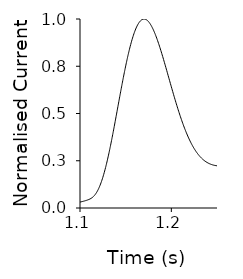
| Category | Y |
|---|---|
| 0.0 | 0 |
| 0.001 | 0 |
| 0.002 | 0 |
| 0.003 | 0 |
| 0.004 | 0 |
| 0.005 | 0 |
| 0.006 | 0 |
| 0.007 | 0.001 |
| 0.008 | 0.001 |
| 0.009 | 0.001 |
| 0.01 | 0.002 |
| 0.011 | 0.002 |
| 0.012 | 0.002 |
| 0.013 | 0.003 |
| 0.014 | 0.004 |
| 0.015 | 0.004 |
| 0.016 | 0.005 |
| 0.017 | 0.006 |
| 0.018 | 0.006 |
| 0.019 | 0.007 |
| 0.02 | 0.008 |
| 0.021 | 0.009 |
| 0.022 | 0.01 |
| 0.023 | 0.011 |
| 0.024 | 0.012 |
| 0.025 | 0.013 |
| 0.026 | 0.014 |
| 0.027 | 0.015 |
| 0.028 | 0.016 |
| 0.029 | 0.017 |
| 0.03 | 0.018 |
| 0.031 | 0.019 |
| 0.032 | 0.021 |
| 0.033 | 0.022 |
| 0.034 | 0.023 |
| 0.035 | 0.024 |
| 0.036 | 0.025 |
| 0.037 | 0.026 |
| 0.038 | 0.027 |
| 0.039 | 0.028 |
| 0.04 | 0.029 |
| 0.041 | 0.03 |
| 0.042 | 0.032 |
| 0.043 | 0.033 |
| 0.044 | 0.033 |
| 0.045 | 0.034 |
| 0.046 | 0.035 |
| 0.047 | 0.036 |
| 0.048 | 0.037 |
| 0.049 | 0.038 |
| 0.05 | 0.039 |
| 0.051 | 0.039 |
| 0.052 | 0.04 |
| 0.053 | 0.041 |
| 0.054 | 0.041 |
| 0.055 | 0.042 |
| 0.056 | 0.043 |
| 0.057 | 0.043 |
| 0.058 | 0.044 |
| 0.059 | 0.044 |
| 0.06 | 0.045 |
| 0.061 | 0.045 |
| 0.062 | 0.045 |
| 0.063 | 0.046 |
| 0.064 | 0.046 |
| 0.065 | 0.046 |
| 0.066 | 0.046 |
| 0.067 | 0.047 |
| 0.068 | 0.047 |
| 0.069 | 0.047 |
| 0.07 | 0.047 |
| 0.071 | 0.047 |
| 0.072 | 0.047 |
| 0.073 | 0.047 |
| 0.074 | 0.047 |
| 0.075 | 0.047 |
| 0.076 | 0.047 |
| 0.077 | 0.047 |
| 0.078 | 0.047 |
| 0.079 | 0.047 |
| 0.08 | 0.047 |
| 0.081 | 0.047 |
| 0.082 | 0.047 |
| 0.083 | 0.047 |
| 0.084 | 0.047 |
| 0.085 | 0.047 |
| 0.086 | 0.047 |
| 0.087 | 0.047 |
| 0.088 | 0.046 |
| 0.089 | 0.046 |
| 0.09 | 0.046 |
| 0.091 | 0.046 |
| 0.092 | 0.046 |
| 0.093 | 0.046 |
| 0.094 | 0.046 |
| 0.095 | 0.046 |
| 0.096 | 0.045 |
| 0.097 | 0.045 |
| 0.098 | 0.045 |
| 0.099 | 0.045 |
| 0.1 | 0.045 |
| 0.101 | 0.045 |
| 0.102 | 0.045 |
| 0.103 | 0.045 |
| 0.104 | 0.045 |
| 0.105 | 0.045 |
| 0.106 | 0.044 |
| 0.107 | 0.044 |
| 0.108 | 0.044 |
| 0.109 | 0.044 |
| 0.11 | 0.044 |
| 0.111 | 0.044 |
| 0.112 | 0.044 |
| 0.113 | 0.044 |
| 0.114 | 0.044 |
| 0.115 | 0.044 |
| 0.116 | 0.044 |
| 0.117 | 0.044 |
| 0.118 | 0.044 |
| 0.119 | 0.044 |
| 0.12 | 0.044 |
| 0.121 | 0.044 |
| 0.122 | 0.044 |
| 0.123 | 0.044 |
| 0.124 | 0.044 |
| 0.125 | 0.043 |
| 0.126 | 0.043 |
| 0.127 | 0.043 |
| 0.128 | 0.043 |
| 0.129 | 0.043 |
| 0.13 | 0.043 |
| 0.131 | 0.043 |
| 0.132 | 0.043 |
| 0.133 | 0.043 |
| 0.134 | 0.043 |
| 0.135 | 0.044 |
| 0.136 | 0.044 |
| 0.137 | 0.044 |
| 0.138 | 0.044 |
| 0.139 | 0.044 |
| 0.14 | 0.044 |
| 0.141 | 0.044 |
| 0.142 | 0.044 |
| 0.143 | 0.044 |
| 0.144 | 0.044 |
| 0.145 | 0.044 |
| 0.146 | 0.044 |
| 0.147 | 0.044 |
| 0.148 | 0.044 |
| 0.149 | 0.044 |
| 0.15 | 0.044 |
| 0.151 | 0.044 |
| 0.152 | 0.044 |
| 0.153 | 0.044 |
| 0.154 | 0.044 |
| 0.155 | 0.044 |
| 0.156 | 0.044 |
| 0.157 | 0.044 |
| 0.158 | 0.044 |
| 0.159 | 0.044 |
| 0.16 | 0.044 |
| 0.161 | 0.044 |
| 0.162 | 0.045 |
| 0.163 | 0.045 |
| 0.164 | 0.045 |
| 0.165 | 0.045 |
| 0.166 | 0.045 |
| 0.167 | 0.045 |
| 0.168 | 0.045 |
| 0.169 | 0.045 |
| 0.17 | 0.045 |
| 0.171 | 0.045 |
| 0.172 | 0.045 |
| 0.173 | 0.045 |
| 0.174 | 0.045 |
| 0.175 | 0.045 |
| 0.176 | 0.045 |
| 0.177 | 0.045 |
| 0.178 | 0.045 |
| 0.179 | 0.045 |
| 0.18 | 0.045 |
| 0.181 | 0.045 |
| 0.182 | 0.045 |
| 0.183 | 0.045 |
| 0.184 | 0.045 |
| 0.185 | 0.045 |
| 0.186 | 0.045 |
| 0.187 | 0.045 |
| 0.188 | 0.045 |
| 0.189 | 0.045 |
| 0.19 | 0.045 |
| 0.191 | 0.045 |
| 0.192 | 0.045 |
| 0.193 | 0.045 |
| 0.194 | 0.045 |
| 0.195 | 0.045 |
| 0.196 | 0.045 |
| 0.197 | 0.045 |
| 0.198 | 0.045 |
| 0.199 | 0.046 |
| 0.2 | 0.046 |
| 0.201 | 0.046 |
| 0.202 | 0.046 |
| 0.203 | 0.046 |
| 0.204 | 0.046 |
| 0.205 | 0.046 |
| 0.206 | 0.046 |
| 0.207 | 0.046 |
| 0.208 | 0.046 |
| 0.209 | 0.046 |
| 0.21 | 0.046 |
| 0.211 | 0.046 |
| 0.212 | 0.046 |
| 0.213 | 0.046 |
| 0.214 | 0.046 |
| 0.215 | 0.046 |
| 0.216 | 0.046 |
| 0.217 | 0.046 |
| 0.218 | 0.046 |
| 0.219 | 0.046 |
| 0.22 | 0.046 |
| 0.221 | 0.046 |
| 0.222 | 0.046 |
| 0.223 | 0.046 |
| 0.224 | 0.046 |
| 0.225 | 0.046 |
| 0.226 | 0.046 |
| 0.227 | 0.046 |
| 0.228 | 0.045 |
| 0.229 | 0.045 |
| 0.23 | 0.045 |
| 0.231 | 0.045 |
| 0.232 | 0.045 |
| 0.233 | 0.045 |
| 0.234 | 0.045 |
| 0.235 | 0.045 |
| 0.236 | 0.045 |
| 0.237 | 0.045 |
| 0.238 | 0.045 |
| 0.239 | 0.044 |
| 0.24 | 0.044 |
| 0.241 | 0.044 |
| 0.242 | 0.044 |
| 0.243 | 0.044 |
| 0.244 | 0.044 |
| 0.245 | 0.044 |
| 0.246 | 0.044 |
| 0.247 | 0.044 |
| 0.248 | 0.044 |
| 0.249 | 0.044 |
| 0.25 | 0.043 |
| 0.251 | 0.043 |
| 0.252 | 0.043 |
| 0.253 | 0.043 |
| 0.254 | 0.043 |
| 0.255 | 0.043 |
| 0.256 | 0.043 |
| 0.257 | 0.043 |
| 0.258 | 0.043 |
| 0.259 | 0.043 |
| 0.26 | 0.043 |
| 0.261 | 0.043 |
| 0.262 | 0.043 |
| 0.263 | 0.043 |
| 0.264 | 0.043 |
| 0.265 | 0.043 |
| 0.266 | 0.043 |
| 0.267 | 0.043 |
| 0.268 | 0.043 |
| 0.269 | 0.043 |
| 0.27 | 0.043 |
| 0.271 | 0.043 |
| 0.272 | 0.043 |
| 0.273 | 0.043 |
| 0.274 | 0.043 |
| 0.275 | 0.043 |
| 0.276 | 0.043 |
| 0.277 | 0.043 |
| 0.278 | 0.043 |
| 0.279 | 0.043 |
| 0.28 | 0.043 |
| 0.281 | 0.043 |
| 0.282 | 0.044 |
| 0.283 | 0.044 |
| 0.284 | 0.044 |
| 0.285 | 0.044 |
| 0.286 | 0.044 |
| 0.287 | 0.044 |
| 0.288 | 0.044 |
| 0.289 | 0.044 |
| 0.29 | 0.044 |
| 0.291 | 0.044 |
| 0.292 | 0.044 |
| 0.293 | 0.044 |
| 0.294 | 0.044 |
| 0.295 | 0.044 |
| 0.296 | 0.044 |
| 0.297 | 0.044 |
| 0.298 | 0.044 |
| 0.299 | 0.044 |
| 0.3 | 0.044 |
| 0.301 | 0.044 |
| 0.302 | 0.044 |
| 0.303 | 0.044 |
| 0.304 | 0.044 |
| 0.305 | 0.044 |
| 0.306 | 0.044 |
| 0.307 | 0.044 |
| 0.308 | 0.044 |
| 0.309 | 0.044 |
| 0.31 | 0.044 |
| 0.311 | 0.044 |
| 0.312 | 0.044 |
| 0.313 | 0.044 |
| 0.314 | 0.044 |
| 0.315 | 0.044 |
| 0.316 | 0.044 |
| 0.317 | 0.044 |
| 0.318 | 0.044 |
| 0.319 | 0.044 |
| 0.32 | 0.044 |
| 0.321 | 0.044 |
| 0.322 | 0.044 |
| 0.323 | 0.044 |
| 0.324 | 0.044 |
| 0.325 | 0.044 |
| 0.326 | 0.044 |
| 0.327 | 0.044 |
| 0.328 | 0.044 |
| 0.329 | 0.043 |
| 0.33 | 0.043 |
| 0.331 | 0.043 |
| 0.332 | 0.043 |
| 0.333 | 0.043 |
| 0.334 | 0.043 |
| 0.335 | 0.043 |
| 0.336 | 0.043 |
| 0.337 | 0.043 |
| 0.338 | 0.043 |
| 0.339 | 0.044 |
| 0.34 | 0.044 |
| 0.341 | 0.045 |
| 0.342 | 0.046 |
| 0.343 | 0.047 |
| 0.344 | 0.048 |
| 0.345 | 0.049 |
| 0.346 | 0.051 |
| 0.347 | 0.053 |
| 0.348 | 0.056 |
| 0.349 | 0.058 |
| 0.35 | 0.061 |
| 0.351 | 0.064 |
| 0.352 | 0.068 |
| 0.353 | 0.072 |
| 0.354 | 0.076 |
| 0.355 | 0.081 |
| 0.356 | 0.085 |
| 0.357 | 0.09 |
| 0.358 | 0.096 |
| 0.359 | 0.101 |
| 0.36 | 0.107 |
| 0.361 | 0.113 |
| 0.362 | 0.118 |
| 0.363 | 0.124 |
| 0.364 | 0.13 |
| 0.365 | 0.136 |
| 0.366 | 0.142 |
| 0.367 | 0.147 |
| 0.368 | 0.152 |
| 0.369 | 0.157 |
| 0.37 | 0.161 |
| 0.371 | 0.165 |
| 0.372 | 0.168 |
| 0.373 | 0.171 |
| 0.374 | 0.173 |
| 0.375 | 0.174 |
| 0.376 | 0.175 |
| 0.377 | 0.175 |
| 0.378 | 0.174 |
| 0.379 | 0.172 |
| 0.38 | 0.169 |
| 0.381 | 0.166 |
| 0.382 | 0.162 |
| 0.383 | 0.157 |
| 0.384 | 0.151 |
| 0.385 | 0.145 |
| 0.386 | 0.138 |
| 0.387 | 0.131 |
| 0.388 | 0.122 |
| 0.389 | 0.114 |
| 0.39 | 0.104 |
| 0.391 | 0.094 |
| 0.392 | 0.084 |
| 0.393 | 0.073 |
| 0.394 | 0.062 |
| 0.395 | 0.051 |
| 0.396 | 0.039 |
| 0.397 | 0.027 |
| 0.398 | 0.015 |
| 0.399 | 0.003 |
| 0.4 | -0.009 |
| 0.401 | -0.022 |
| 0.402 | -0.034 |
| 0.403 | -0.047 |
| 0.404 | -0.06 |
| 0.405 | -0.072 |
| 0.406 | -0.084 |
| 0.407 | -0.096 |
| 0.408 | -0.108 |
| 0.409 | -0.12 |
| 0.41 | -0.131 |
| 0.411 | -0.142 |
| 0.412 | -0.153 |
| 0.413 | -0.163 |
| 0.414 | -0.173 |
| 0.415 | -0.183 |
| 0.416 | -0.192 |
| 0.417 | -0.2 |
| 0.418 | -0.209 |
| 0.419 | -0.216 |
| 0.42 | -0.223 |
| 0.421 | -0.23 |
| 0.422 | -0.236 |
| 0.423 | -0.242 |
| 0.424 | -0.246 |
| 0.425 | -0.251 |
| 0.426 | -0.254 |
| 0.427 | -0.257 |
| 0.428 | -0.26 |
| 0.429 | -0.261 |
| 0.43 | -0.262 |
| 0.431 | -0.263 |
| 0.432 | -0.263 |
| 0.433 | -0.262 |
| 0.434 | -0.261 |
| 0.435 | -0.259 |
| 0.436 | -0.256 |
| 0.437 | -0.253 |
| 0.438 | -0.25 |
| 0.439 | -0.246 |
| 0.44 | -0.242 |
| 0.441 | -0.237 |
| 0.442 | -0.231 |
| 0.443 | -0.226 |
| 0.444 | -0.22 |
| 0.445 | -0.213 |
| 0.446 | -0.207 |
| 0.447 | -0.2 |
| 0.448 | -0.192 |
| 0.449 | -0.184 |
| 0.45 | -0.177 |
| 0.451 | -0.168 |
| 0.452 | -0.16 |
| 0.453 | -0.151 |
| 0.454 | -0.143 |
| 0.455 | -0.134 |
| 0.456 | -0.125 |
| 0.457 | -0.116 |
| 0.458 | -0.106 |
| 0.459 | -0.097 |
| 0.46 | -0.088 |
| 0.461 | -0.078 |
| 0.462 | -0.069 |
| 0.463 | -0.06 |
| 0.464 | -0.051 |
| 0.465 | -0.042 |
| 0.466 | -0.033 |
| 0.467 | -0.025 |
| 0.468 | -0.017 |
| 0.469 | -0.009 |
| 0.47 | -0.002 |
| 0.471 | 0.005 |
| 0.472 | 0.011 |
| 0.473 | 0.017 |
| 0.474 | 0.022 |
| 0.475 | 0.027 |
| 0.476 | 0.031 |
| 0.477 | 0.035 |
| 0.478 | 0.038 |
| 0.479 | 0.041 |
| 0.48 | 0.043 |
| 0.481 | 0.044 |
| 0.482 | 0.045 |
| 0.483 | 0.046 |
| 0.484 | 0.046 |
| 0.485 | 0.046 |
| 0.486 | 0.045 |
| 0.487 | 0.043 |
| 0.488 | 0.041 |
| 0.489 | 0.039 |
| 0.49 | 0.036 |
| 0.491 | 0.033 |
| 0.492 | 0.029 |
| 0.493 | 0.025 |
| 0.494 | 0.021 |
| 0.495 | 0.017 |
| 0.496 | 0.012 |
| 0.497 | 0.007 |
| 0.498 | 0.002 |
| 0.499 | -0.003 |
| 0.5 | -0.009 |
| 0.501 | -0.014 |
| 0.502 | -0.02 |
| 0.503 | -0.025 |
| 0.504 | -0.031 |
| 0.505 | -0.037 |
| 0.506 | -0.042 |
| 0.507 | -0.048 |
| 0.508 | -0.054 |
| 0.509 | -0.059 |
| 0.51 | -0.065 |
| 0.511 | -0.07 |
| 0.512 | -0.076 |
| 0.513 | -0.081 |
| 0.514 | -0.086 |
| 0.515 | -0.091 |
| 0.516 | -0.096 |
| 0.517 | -0.101 |
| 0.518 | -0.105 |
| 0.519 | -0.11 |
| 0.52 | -0.114 |
| 0.521 | -0.117 |
| 0.522 | -0.121 |
| 0.523 | -0.125 |
| 0.524 | -0.128 |
| 0.525 | -0.131 |
| 0.526 | -0.133 |
| 0.527 | -0.136 |
| 0.528 | -0.138 |
| 0.529 | -0.14 |
| 0.53 | -0.142 |
| 0.531 | -0.143 |
| 0.532 | -0.145 |
| 0.533 | -0.146 |
| 0.534 | -0.147 |
| 0.535 | -0.148 |
| 0.536 | -0.149 |
| 0.537 | -0.15 |
| 0.538 | -0.151 |
| 0.539 | -0.151 |
| 0.54 | -0.152 |
| 0.541 | -0.152 |
| 0.542 | -0.152 |
| 0.543 | -0.152 |
| 0.544 | -0.153 |
| 0.545 | -0.153 |
| 0.546 | -0.153 |
| 0.547 | -0.153 |
| 0.548 | -0.153 |
| 0.549 | -0.153 |
| 0.55 | -0.152 |
| 0.551 | -0.152 |
| 0.552 | -0.152 |
| 0.553 | -0.152 |
| 0.554 | -0.152 |
| 0.555 | -0.152 |
| 0.556 | -0.152 |
| 0.557 | -0.151 |
| 0.558 | -0.151 |
| 0.559 | -0.151 |
| 0.56 | -0.151 |
| 0.561 | -0.151 |
| 0.562 | -0.15 |
| 0.563 | -0.15 |
| 0.564 | -0.149 |
| 0.565 | -0.149 |
| 0.566 | -0.148 |
| 0.567 | -0.147 |
| 0.568 | -0.146 |
| 0.569 | -0.145 |
| 0.57 | -0.144 |
| 0.571 | -0.143 |
| 0.572 | -0.141 |
| 0.573 | -0.14 |
| 0.574 | -0.138 |
| 0.575 | -0.136 |
| 0.576 | -0.134 |
| 0.577 | -0.132 |
| 0.578 | -0.129 |
| 0.579 | -0.127 |
| 0.58 | -0.124 |
| 0.581 | -0.122 |
| 0.582 | -0.119 |
| 0.583 | -0.116 |
| 0.584 | -0.113 |
| 0.585 | -0.11 |
| 0.586 | -0.107 |
| 0.587 | -0.104 |
| 0.588 | -0.101 |
| 0.589 | -0.098 |
| 0.59 | -0.094 |
| 0.591 | -0.091 |
| 0.592 | -0.088 |
| 0.593 | -0.085 |
| 0.594 | -0.082 |
| 0.595 | -0.079 |
| 0.596 | -0.076 |
| 0.597 | -0.073 |
| 0.598 | -0.07 |
| 0.599 | -0.067 |
| 0.6 | -0.065 |
| 0.601 | -0.062 |
| 0.602 | -0.06 |
| 0.603 | -0.058 |
| 0.604 | -0.056 |
| 0.605 | -0.054 |
| 0.606 | -0.052 |
| 0.607 | -0.05 |
| 0.608 | -0.049 |
| 0.609 | -0.048 |
| 0.61 | -0.047 |
| 0.611 | -0.045 |
| 0.612 | -0.045 |
| 0.613 | -0.044 |
| 0.614 | -0.043 |
| 0.615 | -0.043 |
| 0.616 | -0.042 |
| 0.617 | -0.042 |
| 0.618 | -0.042 |
| 0.619 | -0.041 |
| 0.62 | -0.041 |
| 0.621 | -0.041 |
| 0.622 | -0.042 |
| 0.623 | -0.042 |
| 0.624 | -0.042 |
| 0.625 | -0.042 |
| 0.626 | -0.042 |
| 0.627 | -0.043 |
| 0.628 | -0.043 |
| 0.629 | -0.043 |
| 0.63 | -0.044 |
| 0.631 | -0.044 |
| 0.632 | -0.044 |
| 0.633 | -0.045 |
| 0.634 | -0.045 |
| 0.635 | -0.045 |
| 0.636 | -0.046 |
| 0.637 | -0.046 |
| 0.638 | -0.047 |
| 0.639 | -0.047 |
| 0.64 | -0.048 |
| 0.641 | -0.048 |
| 0.642 | -0.049 |
| 0.643 | -0.049 |
| 0.644 | -0.05 |
| 0.645 | -0.05 |
| 0.646 | -0.051 |
| 0.647 | -0.052 |
| 0.648 | -0.052 |
| 0.649 | -0.053 |
| 0.65 | -0.053 |
| 0.651 | -0.054 |
| 0.652 | -0.054 |
| 0.653 | -0.054 |
| 0.654 | -0.054 |
| 0.655 | -0.054 |
| 0.656 | -0.054 |
| 0.657 | -0.054 |
| 0.658 | -0.054 |
| 0.659 | -0.053 |
| 0.66 | -0.053 |
| 0.661 | -0.052 |
| 0.662 | -0.052 |
| 0.663 | -0.051 |
| 0.664 | -0.05 |
| 0.665 | -0.049 |
| 0.666 | -0.048 |
| 0.667 | -0.047 |
| 0.668 | -0.046 |
| 0.669 | -0.045 |
| 0.67 | -0.044 |
| 0.671 | -0.043 |
| 0.672 | -0.041 |
| 0.673 | -0.04 |
| 0.674 | -0.039 |
| 0.675 | -0.038 |
| 0.676 | -0.037 |
| 0.677 | -0.036 |
| 0.678 | -0.035 |
| 0.679 | -0.033 |
| 0.68 | -0.032 |
| 0.681 | -0.031 |
| 0.682 | -0.03 |
| 0.683 | -0.029 |
| 0.684 | -0.029 |
| 0.685 | -0.028 |
| 0.686 | -0.027 |
| 0.687 | -0.026 |
| 0.688 | -0.026 |
| 0.689 | -0.025 |
| 0.69 | -0.024 |
| 0.691 | -0.024 |
| 0.692 | -0.023 |
| 0.693 | -0.023 |
| 0.694 | -0.023 |
| 0.695 | -0.022 |
| 0.696 | -0.022 |
| 0.697 | -0.022 |
| 0.698 | -0.021 |
| 0.699 | -0.021 |
| 0.7 | -0.021 |
| 0.701 | -0.021 |
| 0.702 | -0.021 |
| 0.703 | -0.021 |
| 0.704 | -0.021 |
| 0.705 | -0.021 |
| 0.706 | -0.021 |
| 0.707 | -0.021 |
| 0.708 | -0.021 |
| 0.709 | -0.021 |
| 0.71 | -0.021 |
| 0.711 | -0.021 |
| 0.712 | -0.021 |
| 0.713 | -0.021 |
| 0.714 | -0.021 |
| 0.715 | -0.021 |
| 0.716 | -0.021 |
| 0.717 | -0.021 |
| 0.718 | -0.021 |
| 0.719 | -0.021 |
| 0.72 | -0.022 |
| 0.721 | -0.022 |
| 0.722 | -0.022 |
| 0.723 | -0.023 |
| 0.724 | -0.023 |
| 0.725 | -0.024 |
| 0.726 | -0.025 |
| 0.727 | -0.025 |
| 0.728 | -0.026 |
| 0.729 | -0.027 |
| 0.73 | -0.028 |
| 0.731 | -0.029 |
| 0.732 | -0.03 |
| 0.733 | -0.032 |
| 0.734 | -0.033 |
| 0.735 | -0.035 |
| 0.736 | -0.036 |
| 0.737 | -0.038 |
| 0.738 | -0.04 |
| 0.739 | -0.041 |
| 0.74 | -0.043 |
| 0.741 | -0.045 |
| 0.742 | -0.047 |
| 0.743 | -0.049 |
| 0.744 | -0.051 |
| 0.745 | -0.053 |
| 0.746 | -0.055 |
| 0.747 | -0.057 |
| 0.748 | -0.059 |
| 0.749 | -0.061 |
| 0.75 | -0.062 |
| 0.751 | -0.064 |
| 0.752 | -0.065 |
| 0.753 | -0.067 |
| 0.754 | -0.068 |
| 0.755 | -0.07 |
| 0.756 | -0.071 |
| 0.757 | -0.072 |
| 0.758 | -0.072 |
| 0.759 | -0.073 |
| 0.76 | -0.074 |
| 0.761 | -0.074 |
| 0.762 | -0.074 |
| 0.763 | -0.075 |
| 0.764 | -0.075 |
| 0.765 | -0.074 |
| 0.766 | -0.074 |
| 0.767 | -0.074 |
| 0.768 | -0.073 |
| 0.769 | -0.073 |
| 0.77 | -0.072 |
| 0.771 | -0.072 |
| 0.772 | -0.071 |
| 0.773 | -0.07 |
| 0.774 | -0.069 |
| 0.775 | -0.068 |
| 0.776 | -0.067 |
| 0.777 | -0.066 |
| 0.778 | -0.064 |
| 0.779 | -0.063 |
| 0.78 | -0.062 |
| 0.781 | -0.061 |
| 0.782 | -0.059 |
| 0.783 | -0.058 |
| 0.784 | -0.057 |
| 0.785 | -0.055 |
| 0.786 | -0.054 |
| 0.787 | -0.052 |
| 0.788 | -0.051 |
| 0.789 | -0.05 |
| 0.79 | -0.048 |
| 0.791 | -0.047 |
| 0.792 | -0.045 |
| 0.793 | -0.044 |
| 0.794 | -0.043 |
| 0.795 | -0.041 |
| 0.796 | -0.04 |
| 0.797 | -0.039 |
| 0.798 | -0.038 |
| 0.799 | -0.037 |
| 0.8 | -0.035 |
| 0.801 | -0.034 |
| 0.802 | -0.033 |
| 0.803 | -0.032 |
| 0.804 | -0.031 |
| 0.805 | -0.03 |
| 0.806 | -0.029 |
| 0.807 | -0.028 |
| 0.808 | -0.026 |
| 0.809 | -0.025 |
| 0.81 | -0.024 |
| 0.811 | -0.023 |
| 0.812 | -0.022 |
| 0.813 | -0.021 |
| 0.814 | -0.019 |
| 0.815 | -0.018 |
| 0.816 | -0.017 |
| 0.817 | -0.016 |
| 0.818 | -0.015 |
| 0.819 | -0.014 |
| 0.82 | -0.013 |
| 0.821 | -0.012 |
| 0.822 | -0.012 |
| 0.823 | -0.011 |
| 0.824 | -0.01 |
| 0.825 | -0.01 |
| 0.826 | -0.009 |
| 0.827 | -0.009 |
| 0.828 | -0.009 |
| 0.829 | -0.009 |
| 0.83 | -0.009 |
| 0.831 | -0.009 |
| 0.832 | -0.009 |
| 0.833 | -0.009 |
| 0.834 | -0.009 |
| 0.835 | -0.01 |
| 0.836 | -0.01 |
| 0.837 | -0.011 |
| 0.838 | -0.011 |
| 0.839 | -0.012 |
| 0.84 | -0.012 |
| 0.841 | -0.013 |
| 0.842 | -0.014 |
| 0.843 | -0.015 |
| 0.844 | -0.016 |
| 0.845 | -0.017 |
| 0.846 | -0.017 |
| 0.847 | -0.018 |
| 0.848 | -0.019 |
| 0.849 | -0.02 |
| 0.85 | -0.021 |
| 0.851 | -0.022 |
| 0.852 | -0.023 |
| 0.853 | -0.024 |
| 0.854 | -0.025 |
| 0.855 | -0.026 |
| 0.856 | -0.027 |
| 0.857 | -0.028 |
| 0.858 | -0.029 |
| 0.859 | -0.03 |
| 0.86 | -0.031 |
| 0.861 | -0.032 |
| 0.862 | -0.033 |
| 0.863 | -0.033 |
| 0.864 | -0.034 |
| 0.865 | -0.035 |
| 0.866 | -0.035 |
| 0.867 | -0.036 |
| 0.868 | -0.036 |
| 0.869 | -0.037 |
| 0.87 | -0.037 |
| 0.871 | -0.037 |
| 0.872 | -0.037 |
| 0.873 | -0.038 |
| 0.874 | -0.038 |
| 0.875 | -0.038 |
| 0.876 | -0.038 |
| 0.877 | -0.038 |
| 0.878 | -0.038 |
| 0.879 | -0.038 |
| 0.88 | -0.038 |
| 0.881 | -0.037 |
| 0.882 | -0.037 |
| 0.883 | -0.037 |
| 0.884 | -0.037 |
| 0.885 | -0.037 |
| 0.886 | -0.037 |
| 0.887 | -0.036 |
| 0.888 | -0.036 |
| 0.889 | -0.036 |
| 0.89 | -0.036 |
| 0.891 | -0.036 |
| 0.892 | -0.035 |
| 0.893 | -0.035 |
| 0.894 | -0.035 |
| 0.895 | -0.035 |
| 0.896 | -0.035 |
| 0.897 | -0.034 |
| 0.898 | -0.034 |
| 0.899 | -0.034 |
| 0.9 | -0.034 |
| 0.901 | -0.033 |
| 0.902 | -0.033 |
| 0.903 | -0.033 |
| 0.904 | -0.033 |
| 0.905 | -0.032 |
| 0.906 | -0.032 |
| 0.907 | -0.032 |
| 0.908 | -0.032 |
| 0.909 | -0.031 |
| 0.91 | -0.031 |
| 0.911 | -0.031 |
| 0.912 | -0.031 |
| 0.913 | -0.03 |
| 0.914 | -0.03 |
| 0.915 | -0.03 |
| 0.916 | -0.03 |
| 0.917 | -0.03 |
| 0.918 | -0.029 |
| 0.919 | -0.029 |
| 0.92 | -0.029 |
| 0.921 | -0.029 |
| 0.922 | -0.029 |
| 0.923 | -0.03 |
| 0.924 | -0.03 |
| 0.925 | -0.03 |
| 0.926 | -0.03 |
| 0.927 | -0.031 |
| 0.928 | -0.031 |
| 0.929 | -0.031 |
| 0.93 | -0.032 |
| 0.931 | -0.033 |
| 0.932 | -0.033 |
| 0.933 | -0.034 |
| 0.934 | -0.034 |
| 0.935 | -0.035 |
| 0.936 | -0.036 |
| 0.937 | -0.037 |
| 0.938 | -0.037 |
| 0.939 | -0.038 |
| 0.94 | -0.039 |
| 0.941 | -0.04 |
| 0.942 | -0.041 |
| 0.943 | -0.042 |
| 0.944 | -0.043 |
| 0.945 | -0.043 |
| 0.946 | -0.044 |
| 0.947 | -0.045 |
| 0.948 | -0.046 |
| 0.949 | -0.047 |
| 0.95 | -0.048 |
| 0.951 | -0.049 |
| 0.952 | -0.05 |
| 0.953 | -0.051 |
| 0.954 | -0.052 |
| 0.955 | -0.053 |
| 0.956 | -0.054 |
| 0.957 | -0.055 |
| 0.958 | -0.056 |
| 0.959 | -0.057 |
| 0.96 | -0.058 |
| 0.961 | -0.059 |
| 0.962 | -0.06 |
| 0.963 | -0.061 |
| 0.964 | -0.062 |
| 0.965 | -0.063 |
| 0.966 | -0.063 |
| 0.967 | -0.064 |
| 0.968 | -0.065 |
| 0.969 | -0.066 |
| 0.97 | -0.067 |
| 0.971 | -0.067 |
| 0.972 | -0.068 |
| 0.973 | -0.069 |
| 0.974 | -0.069 |
| 0.975 | -0.07 |
| 0.976 | -0.07 |
| 0.977 | -0.071 |
| 0.978 | -0.071 |
| 0.979 | -0.072 |
| 0.98 | -0.072 |
| 0.981 | -0.072 |
| 0.982 | -0.073 |
| 0.983 | -0.073 |
| 0.984 | -0.073 |
| 0.985 | -0.073 |
| 0.986 | -0.073 |
| 0.987 | -0.073 |
| 0.988 | -0.073 |
| 0.989 | -0.072 |
| 0.99 | -0.072 |
| 0.991 | -0.072 |
| 0.992 | -0.072 |
| 0.993 | -0.071 |
| 0.994 | -0.071 |
| 0.995 | -0.07 |
| 0.996 | -0.069 |
| 0.997 | -0.069 |
| 0.998 | -0.068 |
| 0.999 | -0.067 |
| 1.0 | -0.066 |
| 1.001 | -0.065 |
| 1.002 | -0.064 |
| 1.003 | -0.063 |
| 1.004 | -0.061 |
| 1.005 | -0.06 |
| 1.006 | -0.058 |
| 1.007 | -0.057 |
| 1.008 | -0.055 |
| 1.009 | -0.054 |
| 1.01 | -0.052 |
| 1.011 | -0.05 |
| 1.012 | -0.048 |
| 1.013 | -0.046 |
| 1.014 | -0.044 |
| 1.015 | -0.043 |
| 1.016 | -0.041 |
| 1.017 | -0.039 |
| 1.018 | -0.037 |
| 1.019 | -0.035 |
| 1.02 | -0.033 |
| 1.021 | -0.031 |
| 1.022 | -0.029 |
| 1.023 | -0.027 |
| 1.024 | -0.025 |
| 1.025 | -0.023 |
| 1.026 | -0.022 |
| 1.027 | -0.02 |
| 1.028 | -0.018 |
| 1.029 | -0.017 |
| 1.03 | -0.015 |
| 1.031 | -0.014 |
| 1.032 | -0.012 |
| 1.033 | -0.011 |
| 1.034 | -0.01 |
| 1.035 | -0.009 |
| 1.036 | -0.008 |
| 1.037 | -0.007 |
| 1.038 | -0.006 |
| 1.039 | -0.005 |
| 1.04 | -0.005 |
| 1.041 | -0.004 |
| 1.042 | -0.004 |
| 1.043 | -0.004 |
| 1.044 | -0.004 |
| 1.045 | -0.004 |
| 1.046 | -0.004 |
| 1.047 | -0.004 |
| 1.048 | -0.004 |
| 1.049 | -0.004 |
| 1.05 | -0.005 |
| 1.051 | -0.005 |
| 1.052 | -0.005 |
| 1.053 | -0.006 |
| 1.054 | -0.006 |
| 1.055 | -0.006 |
| 1.056 | -0.006 |
| 1.057 | -0.006 |
| 1.058 | -0.006 |
| 1.059 | -0.006 |
| 1.06 | -0.006 |
| 1.061 | -0.006 |
| 1.062 | -0.006 |
| 1.063 | -0.006 |
| 1.064 | -0.005 |
| 1.065 | -0.005 |
| 1.066 | -0.004 |
| 1.067 | -0.003 |
| 1.068 | -0.003 |
| 1.069 | -0.002 |
| 1.07 | -0.001 |
| 1.071 | 0 |
| 1.072 | 0.001 |
| 1.073 | 0.002 |
| 1.074 | 0.003 |
| 1.075 | 0.004 |
| 1.076 | 0.006 |
| 1.077 | 0.007 |
| 1.078 | 0.008 |
| 1.079 | 0.009 |
| 1.08 | 0.01 |
| 1.081 | 0.012 |
| 1.082 | 0.013 |
| 1.083 | 0.014 |
| 1.084 | 0.015 |
| 1.085 | 0.016 |
| 1.086 | 0.017 |
| 1.087 | 0.019 |
| 1.088 | 0.02 |
| 1.089 | 0.021 |
| 1.09 | 0.022 |
| 1.091 | 0.023 |
| 1.092 | 0.024 |
| 1.093 | 0.025 |
| 1.094 | 0.025 |
| 1.095 | 0.026 |
| 1.096 | 0.027 |
| 1.097 | 0.028 |
| 1.098 | 0.029 |
| 1.099 | 0.03 |
| 1.1 | 0.031 |
| 1.101 | 0.032 |
| 1.102 | 0.034 |
| 1.103 | 0.035 |
| 1.104 | 0.036 |
| 1.105 | 0.037 |
| 1.106 | 0.039 |
| 1.107 | 0.04 |
| 1.108 | 0.042 |
| 1.109 | 0.044 |
| 1.11 | 0.046 |
| 1.111 | 0.048 |
| 1.112 | 0.051 |
| 1.113 | 0.054 |
| 1.114 | 0.058 |
| 1.115 | 0.062 |
| 1.116 | 0.067 |
| 1.117 | 0.074 |
| 1.118 | 0.081 |
| 1.119 | 0.089 |
| 1.12 | 0.098 |
| 1.121 | 0.109 |
| 1.122 | 0.121 |
| 1.123 | 0.133 |
| 1.124 | 0.147 |
| 1.125 | 0.162 |
| 1.126 | 0.178 |
| 1.127 | 0.196 |
| 1.128 | 0.214 |
| 1.129 | 0.233 |
| 1.13 | 0.254 |
| 1.131 | 0.275 |
| 1.132 | 0.297 |
| 1.133 | 0.32 |
| 1.134 | 0.344 |
| 1.135 | 0.368 |
| 1.136 | 0.393 |
| 1.137 | 0.419 |
| 1.138 | 0.444 |
| 1.139 | 0.471 |
| 1.14 | 0.497 |
| 1.141 | 0.523 |
| 1.142 | 0.55 |
| 1.143 | 0.576 |
| 1.144 | 0.602 |
| 1.145 | 0.628 |
| 1.146 | 0.654 |
| 1.147 | 0.679 |
| 1.148 | 0.703 |
| 1.149 | 0.728 |
| 1.15 | 0.751 |
| 1.151 | 0.774 |
| 1.152 | 0.796 |
| 1.153 | 0.817 |
| 1.154 | 0.837 |
| 1.155 | 0.856 |
| 1.156 | 0.874 |
| 1.157 | 0.891 |
| 1.158 | 0.907 |
| 1.159 | 0.921 |
| 1.16 | 0.935 |
| 1.161 | 0.947 |
| 1.162 | 0.958 |
| 1.163 | 0.968 |
| 1.164 | 0.976 |
| 1.165 | 0.983 |
| 1.166 | 0.989 |
| 1.167 | 0.994 |
| 1.168 | 0.997 |
| 1.169 | 0.999 |
| 1.17 | 1 |
| 1.171 | 1 |
| 1.172 | 0.998 |
| 1.173 | 0.995 |
| 1.174 | 0.991 |
| 1.175 | 0.986 |
| 1.176 | 0.98 |
| 1.177 | 0.973 |
| 1.178 | 0.965 |
| 1.179 | 0.956 |
| 1.18 | 0.946 |
| 1.181 | 0.935 |
| 1.182 | 0.924 |
| 1.183 | 0.912 |
| 1.184 | 0.899 |
| 1.185 | 0.885 |
| 1.186 | 0.871 |
| 1.187 | 0.856 |
| 1.188 | 0.841 |
| 1.189 | 0.826 |
| 1.19 | 0.81 |
| 1.191 | 0.794 |
| 1.192 | 0.777 |
| 1.193 | 0.761 |
| 1.194 | 0.744 |
| 1.195 | 0.727 |
| 1.196 | 0.71 |
| 1.197 | 0.693 |
| 1.198 | 0.675 |
| 1.199 | 0.658 |
| 1.2 | 0.641 |
| 1.201 | 0.625 |
| 1.202 | 0.608 |
| 1.203 | 0.591 |
| 1.204 | 0.575 |
| 1.205 | 0.559 |
| 1.206 | 0.543 |
| 1.207 | 0.527 |
| 1.208 | 0.512 |
| 1.209 | 0.497 |
| 1.21 | 0.483 |
| 1.211 | 0.468 |
| 1.212 | 0.455 |
| 1.213 | 0.441 |
| 1.214 | 0.428 |
| 1.215 | 0.416 |
| 1.216 | 0.404 |
| 1.217 | 0.392 |
| 1.218 | 0.381 |
| 1.219 | 0.37 |
| 1.22 | 0.359 |
| 1.221 | 0.35 |
| 1.222 | 0.34 |
| 1.223 | 0.331 |
| 1.224 | 0.322 |
| 1.225 | 0.314 |
| 1.226 | 0.307 |
| 1.227 | 0.299 |
| 1.228 | 0.292 |
| 1.229 | 0.286 |
| 1.23 | 0.28 |
| 1.231 | 0.274 |
| 1.232 | 0.269 |
| 1.233 | 0.264 |
| 1.234 | 0.259 |
| 1.235 | 0.255 |
| 1.236 | 0.251 |
| 1.237 | 0.248 |
| 1.238 | 0.244 |
| 1.239 | 0.241 |
| 1.24 | 0.239 |
| 1.241 | 0.236 |
| 1.242 | 0.234 |
| 1.243 | 0.232 |
| 1.244 | 0.23 |
| 1.245 | 0.228 |
| 1.246 | 0.227 |
| 1.247 | 0.226 |
| 1.248 | 0.225 |
| 1.249 | 0.224 |
| 1.25 | 0.223 |
| 1.251 | 0.223 |
| 1.252 | 0.222 |
| 1.253 | 0.222 |
| 1.254 | 0.222 |
| 1.255 | 0.221 |
| 1.256 | 0.221 |
| 1.257 | 0.221 |
| 1.258 | 0.221 |
| 1.259 | 0.221 |
| 1.26 | 0.222 |
| 1.261 | 0.222 |
| 1.262 | 0.222 |
| 1.263 | 0.222 |
| 1.264 | 0.222 |
| 1.265 | 0.223 |
| 1.266 | 0.223 |
| 1.267 | 0.223 |
| 1.268 | 0.223 |
| 1.269 | 0.224 |
| 1.27 | 0.224 |
| 1.271 | 0.224 |
| 1.272 | 0.224 |
| 1.273 | 0.224 |
| 1.274 | 0.224 |
| 1.275 | 0.224 |
| 1.276 | 0.224 |
| 1.277 | 0.224 |
| 1.278 | 0.224 |
| 1.279 | 0.224 |
| 1.28 | 0.224 |
| 1.281 | 0.224 |
| 1.282 | 0.224 |
| 1.283 | 0.223 |
| 1.284 | 0.223 |
| 1.285 | 0.223 |
| 1.286 | 0.222 |
| 1.287 | 0.222 |
| 1.288 | 0.221 |
| 1.289 | 0.221 |
| 1.29 | 0.22 |
| 1.291 | 0.219 |
| 1.292 | 0.219 |
| 1.293 | 0.218 |
| 1.294 | 0.217 |
| 1.295 | 0.217 |
| 1.296 | 0.216 |
| 1.297 | 0.215 |
| 1.298 | 0.214 |
| 1.299 | 0.213 |
| 1.3 | 0.212 |
| 1.301 | 0.211 |
| 1.302 | 0.21 |
| 1.303 | 0.209 |
| 1.304 | 0.208 |
| 1.305 | 0.207 |
| 1.306 | 0.206 |
| 1.307 | 0.205 |
| 1.308 | 0.204 |
| 1.309 | 0.203 |
| 1.31 | 0.202 |
| 1.311 | 0.201 |
| 1.312 | 0.2 |
| 1.313 | 0.199 |
| 1.314 | 0.198 |
| 1.315 | 0.197 |
| 1.316 | 0.196 |
| 1.317 | 0.195 |
| 1.318 | 0.193 |
| 1.319 | 0.192 |
| 1.32 | 0.191 |
| 1.321 | 0.19 |
| 1.322 | 0.189 |
| 1.323 | 0.188 |
| 1.324 | 0.187 |
| 1.325 | 0.186 |
| 1.326 | 0.186 |
| 1.327 | 0.185 |
| 1.328 | 0.184 |
| 1.329 | 0.183 |
| 1.33 | 0.182 |
| 1.331 | 0.181 |
| 1.332 | 0.18 |
| 1.333 | 0.179 |
| 1.334 | 0.178 |
| 1.335 | 0.177 |
| 1.336 | 0.176 |
| 1.337 | 0.176 |
| 1.338 | 0.175 |
| 1.339 | 0.174 |
| 1.34 | 0.173 |
| 1.341 | 0.172 |
| 1.342 | 0.172 |
| 1.343 | 0.171 |
| 1.344 | 0.17 |
| 1.345 | 0.169 |
| 1.346 | 0.168 |
| 1.347 | 0.168 |
| 1.348 | 0.167 |
| 1.349 | 0.166 |
| 1.35 | 0.165 |
| 1.351 | 0.165 |
| 1.352 | 0.164 |
| 1.353 | 0.163 |
| 1.354 | 0.163 |
| 1.355 | 0.162 |
| 1.356 | 0.161 |
| 1.357 | 0.161 |
| 1.358 | 0.16 |
| 1.359 | 0.159 |
| 1.36 | 0.159 |
| 1.361 | 0.158 |
| 1.362 | 0.157 |
| 1.363 | 0.157 |
| 1.364 | 0.156 |
| 1.365 | 0.155 |
| 1.366 | 0.155 |
| 1.367 | 0.154 |
| 1.368 | 0.154 |
| 1.369 | 0.153 |
| 1.37 | 0.153 |
| 1.371 | 0.152 |
| 1.372 | 0.151 |
| 1.373 | 0.151 |
| 1.374 | 0.15 |
| 1.375 | 0.15 |
| 1.376 | 0.149 |
| 1.377 | 0.149 |
| 1.378 | 0.148 |
| 1.379 | 0.148 |
| 1.38 | 0.147 |
| 1.381 | 0.147 |
| 1.382 | 0.146 |
| 1.383 | 0.145 |
| 1.384 | 0.145 |
| 1.385 | 0.144 |
| 1.386 | 0.144 |
| 1.387 | 0.143 |
| 1.388 | 0.143 |
| 1.389 | 0.142 |
| 1.39 | 0.142 |
| 1.391 | 0.141 |
| 1.392 | 0.141 |
| 1.393 | 0.14 |
| 1.394 | 0.139 |
| 1.395 | 0.139 |
| 1.396 | 0.138 |
| 1.397 | 0.138 |
| 1.398 | 0.137 |
| 1.399 | 0.137 |
| 1.4 | 0.136 |
| 1.401 | 0.135 |
| 1.402 | 0.135 |
| 1.403 | 0.134 |
| 1.404 | 0.134 |
| 1.405 | 0.133 |
| 1.406 | 0.133 |
| 1.407 | 0.132 |
| 1.408 | 0.132 |
| 1.409 | 0.131 |
| 1.41 | 0.131 |
| 1.411 | 0.131 |
| 1.412 | 0.13 |
| 1.413 | 0.13 |
| 1.414 | 0.129 |
| 1.415 | 0.129 |
| 1.416 | 0.129 |
| 1.417 | 0.128 |
| 1.418 | 0.128 |
| 1.419 | 0.128 |
| 1.42 | 0.127 |
| 1.421 | 0.127 |
| 1.422 | 0.127 |
| 1.423 | 0.126 |
| 1.424 | 0.126 |
| 1.425 | 0.126 |
| 1.426 | 0.126 |
| 1.427 | 0.125 |
| 1.428 | 0.125 |
| 1.429 | 0.125 |
| 1.43 | 0.125 |
| 1.431 | 0.125 |
| 1.432 | 0.124 |
| 1.433 | 0.124 |
| 1.434 | 0.124 |
| 1.435 | 0.124 |
| 1.436 | 0.123 |
| 1.437 | 0.123 |
| 1.438 | 0.123 |
| 1.439 | 0.123 |
| 1.44 | 0.122 |
| 1.441 | 0.122 |
| 1.442 | 0.122 |
| 1.443 | 0.122 |
| 1.444 | 0.121 |
| 1.445 | 0.121 |
| 1.446 | 0.121 |
| 1.447 | 0.12 |
| 1.448 | 0.12 |
| 1.449 | 0.12 |
| 1.45 | 0.119 |
| 1.451 | 0.119 |
| 1.452 | 0.119 |
| 1.453 | 0.118 |
| 1.454 | 0.118 |
| 1.455 | 0.118 |
| 1.456 | 0.117 |
| 1.457 | 0.117 |
| 1.458 | 0.117 |
| 1.459 | 0.116 |
| 1.46 | 0.116 |
| 1.461 | 0.116 |
| 1.462 | 0.116 |
| 1.463 | 0.115 |
| 1.464 | 0.115 |
| 1.465 | 0.115 |
| 1.466 | 0.114 |
| 1.467 | 0.114 |
| 1.468 | 0.114 |
| 1.469 | 0.114 |
| 1.47 | 0.113 |
| 1.471 | 0.113 |
| 1.472 | 0.113 |
| 1.473 | 0.113 |
| 1.474 | 0.112 |
| 1.475 | 0.112 |
| 1.476 | 0.112 |
| 1.477 | 0.112 |
| 1.478 | 0.112 |
| 1.479 | 0.112 |
| 1.48 | 0.111 |
| 1.481 | 0.111 |
| 1.482 | 0.111 |
| 1.483 | 0.111 |
| 1.484 | 0.111 |
| 1.485 | 0.111 |
| 1.486 | 0.111 |
| 1.487 | 0.11 |
| 1.488 | 0.11 |
| 1.489 | 0.11 |
| 1.49 | 0.11 |
| 1.491 | 0.11 |
| 1.492 | 0.11 |
| 1.493 | 0.11 |
| 1.494 | 0.11 |
| 1.495 | 0.109 |
| 1.496 | 0.109 |
| 1.497 | 0.109 |
| 1.498 | 0.109 |
| 1.499 | 0.109 |
| 1.5 | 0.109 |
| 1.501 | 0.109 |
| 1.502 | 0.109 |
| 1.503 | 0.108 |
| 1.504 | 0.108 |
| 1.505 | 0.108 |
| 1.506 | 0.108 |
| 1.507 | 0.108 |
| 1.508 | 0.108 |
| 1.509 | 0.108 |
| 1.51 | 0.108 |
| 1.511 | 0.108 |
| 1.512 | 0.107 |
| 1.513 | 0.107 |
| 1.514 | 0.107 |
| 1.515 | 0.107 |
| 1.516 | 0.107 |
| 1.517 | 0.107 |
| 1.518 | 0.107 |
| 1.519 | 0.107 |
| 1.52 | 0.107 |
| 1.521 | 0.107 |
| 1.522 | 0.107 |
| 1.523 | 0.107 |
| 1.524 | 0.106 |
| 1.525 | 0.106 |
| 1.526 | 0.106 |
| 1.527 | 0.106 |
| 1.528 | 0.106 |
| 1.529 | 0.106 |
| 1.53 | 0.106 |
| 1.531 | 0.106 |
| 1.532 | 0.106 |
| 1.533 | 0.106 |
| 1.534 | 0.106 |
| 1.535 | 0.106 |
| 1.536 | 0.106 |
| 1.537 | 0.106 |
| 1.538 | 0.106 |
| 1.539 | 0.106 |
| 1.54 | 0.105 |
| 1.541 | 0.105 |
| 1.542 | 0.105 |
| 1.543 | 0.105 |
| 1.544 | 0.105 |
| 1.545 | 0.105 |
| 1.546 | 0.105 |
| 1.547 | 0.105 |
| 1.548 | 0.105 |
| 1.549 | 0.105 |
| 1.55 | 0.104 |
| 1.551 | 0.104 |
| 1.552 | 0.104 |
| 1.553 | 0.104 |
| 1.554 | 0.104 |
| 1.555 | 0.104 |
| 1.556 | 0.104 |
| 1.557 | 0.104 |
| 1.558 | 0.104 |
| 1.559 | 0.104 |
| 1.56 | 0.103 |
| 1.561 | 0.103 |
| 1.562 | 0.103 |
| 1.563 | 0.103 |
| 1.564 | 0.103 |
| 1.565 | 0.103 |
| 1.566 | 0.103 |
| 1.567 | 0.103 |
| 1.568 | 0.103 |
| 1.569 | 0.103 |
| 1.57 | 0.103 |
| 1.571 | 0.103 |
| 1.572 | 0.103 |
| 1.573 | 0.103 |
| 1.574 | 0.103 |
| 1.575 | 0.103 |
| 1.576 | 0.103 |
| 1.577 | 0.103 |
| 1.578 | 0.103 |
| 1.579 | 0.103 |
| 1.58 | 0.103 |
| 1.581 | 0.103 |
| 1.582 | 0.103 |
| 1.583 | 0.103 |
| 1.584 | 0.103 |
| 1.585 | 0.103 |
| 1.586 | 0.103 |
| 1.587 | 0.103 |
| 1.588 | 0.103 |
| 1.589 | 0.103 |
| 1.59 | 0.103 |
| 1.591 | 0.103 |
| 1.592 | 0.103 |
| 1.593 | 0.103 |
| 1.594 | 0.103 |
| 1.595 | 0.103 |
| 1.596 | 0.103 |
| 1.597 | 0.103 |
| 1.598 | 0.103 |
| 1.599 | 0.103 |
| 1.6 | 0.103 |
| 1.601 | 0.103 |
| 1.602 | 0.102 |
| 1.603 | 0.102 |
| 1.604 | 0.102 |
| 1.605 | 0.102 |
| 1.606 | 0.102 |
| 1.607 | 0.102 |
| 1.608 | 0.102 |
| 1.609 | 0.102 |
| 1.61 | 0.102 |
| 1.611 | 0.102 |
| 1.612 | 0.102 |
| 1.613 | 0.102 |
| 1.614 | 0.102 |
| 1.615 | 0.102 |
| 1.616 | 0.102 |
| 1.617 | 0.102 |
| 1.618 | 0.102 |
| 1.619 | 0.102 |
| 1.62 | 0.102 |
| 1.621 | 0.102 |
| 1.622 | 0.102 |
| 1.623 | 0.102 |
| 1.624 | 0.102 |
| 1.625 | 0.102 |
| 1.626 | 0.102 |
| 1.627 | 0.102 |
| 1.628 | 0.102 |
| 1.629 | 0.102 |
| 1.63 | 0.102 |
| 1.631 | 0.102 |
| 1.632 | 0.102 |
| 1.633 | 0.102 |
| 1.634 | 0.102 |
| 1.635 | 0.102 |
| 1.636 | 0.102 |
| 1.637 | 0.102 |
| 1.638 | 0.102 |
| 1.639 | 0.102 |
| 1.64 | 0.102 |
| 1.641 | 0.102 |
| 1.642 | 0.102 |
| 1.643 | 0.102 |
| 1.644 | 0.101 |
| 1.645 | 0.101 |
| 1.646 | 0.101 |
| 1.647 | 0.101 |
| 1.648 | 0.101 |
| 1.649 | 0.101 |
| 1.65 | 0.101 |
| 1.651 | 0.101 |
| 1.652 | 0.101 |
| 1.653 | 0.101 |
| 1.654 | 0.101 |
| 1.655 | 0.101 |
| 1.656 | 0.101 |
| 1.657 | 0.101 |
| 1.658 | 0.101 |
| 1.659 | 0.101 |
| 1.66 | 0.101 |
| 1.661 | 0.101 |
| 1.662 | 0.101 |
| 1.663 | 0.101 |
| 1.664 | 0.101 |
| 1.665 | 0.101 |
| 1.666 | 0.101 |
| 1.667 | 0.101 |
| 1.668 | 0.101 |
| 1.669 | 0.101 |
| 1.67 | 0.101 |
| 1.671 | 0.101 |
| 1.672 | 0.101 |
| 1.673 | 0.101 |
| 1.674 | 0.1 |
| 1.675 | 0.1 |
| 1.676 | 0.1 |
| 1.677 | 0.1 |
| 1.678 | 0.1 |
| 1.679 | 0.1 |
| 1.68 | 0.1 |
| 1.681 | 0.1 |
| 1.682 | 0.1 |
| 1.683 | 0.1 |
| 1.684 | 0.1 |
| 1.685 | 0.1 |
| 1.686 | 0.1 |
| 1.687 | 0.099 |
| 1.688 | 0.099 |
| 1.689 | 0.099 |
| 1.69 | 0.099 |
| 1.691 | 0.099 |
| 1.692 | 0.099 |
| 1.693 | 0.099 |
| 1.694 | 0.098 |
| 1.695 | 0.098 |
| 1.696 | 0.098 |
| 1.697 | 0.098 |
| 1.698 | 0.098 |
| 1.699 | 0.098 |
| 1.7 | 0.097 |
| 1.701 | 0.097 |
| 1.702 | 0.097 |
| 1.703 | 0.097 |
| 1.704 | 0.097 |
| 1.705 | 0.097 |
| 1.706 | 0.096 |
| 1.707 | 0.096 |
| 1.708 | 0.096 |
| 1.709 | 0.096 |
| 1.71 | 0.096 |
| 1.711 | 0.096 |
| 1.712 | 0.096 |
| 1.713 | 0.096 |
| 1.714 | 0.095 |
| 1.715 | 0.095 |
| 1.716 | 0.095 |
| 1.717 | 0.095 |
| 1.718 | 0.095 |
| 1.719 | 0.095 |
| 1.72 | 0.095 |
| 1.721 | 0.095 |
| 1.722 | 0.095 |
| 1.723 | 0.095 |
| 1.724 | 0.095 |
| 1.725 | 0.095 |
| 1.726 | 0.094 |
| 1.727 | 0.094 |
| 1.728 | 0.094 |
| 1.729 | 0.094 |
| 1.73 | 0.094 |
| 1.731 | 0.094 |
| 1.732 | 0.094 |
| 1.733 | 0.094 |
| 1.734 | 0.094 |
| 1.735 | 0.093 |
| 1.736 | 0.093 |
| 1.737 | 0.093 |
| 1.738 | 0.093 |
| 1.739 | 0.093 |
| 1.74 | 0.093 |
| 1.741 | 0.093 |
| 1.742 | 0.092 |
| 1.743 | 0.092 |
| 1.744 | 0.092 |
| 1.745 | 0.092 |
| 1.746 | 0.092 |
| 1.747 | 0.091 |
| 1.748 | 0.091 |
| 1.749 | 0.091 |
| 1.75 | 0.091 |
| 1.751 | 0.09 |
| 1.752 | 0.09 |
| 1.753 | 0.09 |
| 1.754 | 0.09 |
| 1.755 | 0.09 |
| 1.756 | 0.09 |
| 1.757 | 0.089 |
| 1.758 | 0.089 |
| 1.759 | 0.089 |
| 1.76 | 0.089 |
| 1.761 | 0.089 |
| 1.762 | 0.089 |
| 1.763 | 0.088 |
| 1.764 | 0.088 |
| 1.765 | 0.088 |
| 1.766 | 0.088 |
| 1.767 | 0.088 |
| 1.768 | 0.088 |
| 1.769 | 0.088 |
| 1.77 | 0.088 |
| 1.771 | 0.088 |
| 1.772 | 0.088 |
| 1.773 | 0.087 |
| 1.774 | 0.087 |
| 1.775 | 0.087 |
| 1.776 | 0.087 |
| 1.777 | 0.087 |
| 1.778 | 0.087 |
| 1.779 | 0.087 |
| 1.78 | 0.087 |
| 1.781 | 0.087 |
| 1.782 | 0.087 |
| 1.783 | 0.087 |
| 1.784 | 0.086 |
| 1.785 | 0.086 |
| 1.786 | 0.086 |
| 1.787 | 0.086 |
| 1.788 | 0.086 |
| 1.789 | 0.086 |
| 1.79 | 0.085 |
| 1.791 | 0.085 |
| 1.792 | 0.085 |
| 1.793 | 0.085 |
| 1.794 | 0.085 |
| 1.795 | 0.084 |
| 1.796 | 0.084 |
| 1.797 | 0.084 |
| 1.798 | 0.084 |
| 1.799 | 0.083 |
| 1.8 | 0.083 |
| 1.801 | 0.083 |
| 1.802 | 0.083 |
| 1.803 | 0.083 |
| 1.804 | 0.083 |
| 1.805 | 0.082 |
| 1.806 | 0.082 |
| 1.807 | 0.082 |
| 1.808 | 0.082 |
| 1.809 | 0.082 |
| 1.81 | 0.082 |
| 1.811 | 0.082 |
| 1.812 | 0.082 |
| 1.813 | 0.082 |
| 1.814 | 0.082 |
| 1.815 | 0.082 |
| 1.816 | 0.082 |
| 1.817 | 0.082 |
| 1.818 | 0.082 |
| 1.819 | 0.082 |
| 1.82 | 0.082 |
| 1.821 | 0.082 |
| 1.822 | 0.082 |
| 1.823 | 0.082 |
| 1.824 | 0.082 |
| 1.825 | 0.082 |
| 1.826 | 0.082 |
| 1.827 | 0.082 |
| 1.828 | 0.082 |
| 1.829 | 0.082 |
| 1.83 | 0.082 |
| 1.831 | 0.082 |
| 1.832 | 0.082 |
| 1.833 | 0.082 |
| 1.834 | 0.082 |
| 1.835 | 0.082 |
| 1.836 | 0.082 |
| 1.837 | 0.082 |
| 1.838 | 0.082 |
| 1.839 | 0.082 |
| 1.84 | 0.082 |
| 1.841 | 0.082 |
| 1.842 | 0.082 |
| 1.843 | 0.082 |
| 1.844 | 0.082 |
| 1.845 | 0.081 |
| 1.846 | 0.081 |
| 1.847 | 0.081 |
| 1.848 | 0.081 |
| 1.849 | 0.081 |
| 1.85 | 0.081 |
| 1.851 | 0.08 |
| 1.852 | 0.08 |
| 1.853 | 0.08 |
| 1.854 | 0.08 |
| 1.855 | 0.08 |
| 1.856 | 0.079 |
| 1.857 | 0.079 |
| 1.858 | 0.079 |
| 1.859 | 0.079 |
| 1.86 | 0.079 |
| 1.861 | 0.079 |
| 1.862 | 0.079 |
| 1.863 | 0.078 |
| 1.864 | 0.078 |
| 1.865 | 0.078 |
| 1.866 | 0.078 |
| 1.867 | 0.078 |
| 1.868 | 0.078 |
| 1.869 | 0.078 |
| 1.87 | 0.078 |
| 1.871 | 0.077 |
| 1.872 | 0.077 |
| 1.873 | 0.077 |
| 1.874 | 0.077 |
| 1.875 | 0.077 |
| 1.876 | 0.077 |
| 1.877 | 0.077 |
| 1.878 | 0.077 |
| 1.879 | 0.077 |
| 1.88 | 0.077 |
| 1.881 | 0.077 |
| 1.882 | 0.076 |
| 1.883 | 0.076 |
| 1.884 | 0.076 |
| 1.885 | 0.076 |
| 1.886 | 0.076 |
| 1.887 | 0.076 |
| 1.888 | 0.076 |
| 1.889 | 0.076 |
| 1.89 | 0.076 |
| 1.891 | 0.076 |
| 1.892 | 0.075 |
| 1.893 | 0.075 |
| 1.894 | 0.075 |
| 1.895 | 0.075 |
| 1.896 | 0.075 |
| 1.897 | 0.075 |
| 1.898 | 0.075 |
| 1.899 | 0.075 |
| 1.9 | 0.075 |
| 1.901 | 0.074 |
| 1.902 | 0.074 |
| 1.903 | 0.074 |
| 1.904 | 0.074 |
| 1.905 | 0.074 |
| 1.906 | 0.074 |
| 1.907 | 0.074 |
| 1.908 | 0.074 |
| 1.909 | 0.074 |
| 1.91 | 0.074 |
| 1.911 | 0.074 |
| 1.912 | 0.074 |
| 1.913 | 0.074 |
| 1.914 | 0.074 |
| 1.915 | 0.074 |
| 1.916 | 0.074 |
| 1.917 | 0.074 |
| 1.918 | 0.074 |
| 1.919 | 0.074 |
| 1.92 | 0.074 |
| 1.921 | 0.075 |
| 1.922 | 0.075 |
| 1.923 | 0.075 |
| 1.924 | 0.075 |
| 1.925 | 0.075 |
| 1.926 | 0.075 |
| 1.927 | 0.075 |
| 1.928 | 0.075 |
| 1.929 | 0.075 |
| 1.93 | 0.075 |
| 1.931 | 0.075 |
| 1.932 | 0.076 |
| 1.933 | 0.076 |
| 1.934 | 0.076 |
| 1.935 | 0.076 |
| 1.936 | 0.076 |
| 1.937 | 0.076 |
| 1.938 | 0.076 |
| 1.939 | 0.076 |
| 1.94 | 0.076 |
| 1.941 | 0.076 |
| 1.942 | 0.076 |
| 1.943 | 0.076 |
| 1.944 | 0.076 |
| 1.945 | 0.076 |
| 1.946 | 0.076 |
| 1.947 | 0.076 |
| 1.948 | 0.076 |
| 1.949 | 0.076 |
| 1.95 | 0.076 |
| 1.951 | 0.076 |
| 1.952 | 0.076 |
| 1.953 | 0.076 |
| 1.954 | 0.076 |
| 1.955 | 0.076 |
| 1.956 | 0.077 |
| 1.957 | 0.077 |
| 1.958 | 0.077 |
| 1.959 | 0.077 |
| 1.96 | 0.077 |
| 1.961 | 0.077 |
| 1.962 | 0.077 |
| 1.963 | 0.077 |
| 1.964 | 0.077 |
| 1.965 | 0.077 |
| 1.966 | 0.077 |
| 1.967 | 0.078 |
| 1.968 | 0.078 |
| 1.969 | 0.078 |
| 1.97 | 0.078 |
| 1.971 | 0.078 |
| 1.972 | 0.078 |
| 1.973 | 0.078 |
| 1.974 | 0.078 |
| 1.975 | 0.078 |
| 1.976 | 0.078 |
| 1.977 | 0.078 |
| 1.978 | 0.078 |
| 1.979 | 0.078 |
| 1.98 | 0.078 |
| 1.981 | 0.078 |
| 1.982 | 0.078 |
| 1.983 | 0.078 |
| 1.984 | 0.078 |
| 1.985 | 0.078 |
| 1.986 | 0.078 |
| 1.987 | 0.078 |
| 1.988 | 0.077 |
| 1.989 | 0.077 |
| 1.99 | 0.077 |
| 1.991 | 0.077 |
| 1.992 | 0.077 |
| 1.993 | 0.077 |
| 1.994 | 0.077 |
| 1.995 | 0.077 |
| 1.996 | 0.077 |
| 1.997 | 0.077 |
| 1.998 | 0.076 |
| 1.999 | 0.076 |
| 2.0 | 0.076 |
| 2.001 | 0.076 |
| 2.002 | 0.076 |
| 2.003 | 0.076 |
| 2.004 | 0.076 |
| 2.005 | 0.076 |
| 2.006 | 0.076 |
| 2.007 | 0.076 |
| 2.008 | 0.076 |
| 2.009 | 0.076 |
| 2.01 | 0.076 |
| 2.011 | 0.076 |
| 2.012 | 0.076 |
| 2.013 | 0.076 |
| 2.014 | 0.076 |
| 2.015 | 0.076 |
| 2.016 | 0.076 |
| 2.017 | 0.076 |
| 2.018 | 0.076 |
| 2.019 | 0.076 |
| 2.02 | 0.076 |
| 2.021 | 0.076 |
| 2.022 | 0.076 |
| 2.023 | 0.076 |
| 2.024 | 0.076 |
| 2.025 | 0.076 |
| 2.026 | 0.076 |
| 2.027 | 0.076 |
| 2.028 | 0.076 |
| 2.029 | 0.075 |
| 2.03 | 0.075 |
| 2.031 | 0.075 |
| 2.032 | 0.075 |
| 2.033 | 0.075 |
| 2.034 | 0.075 |
| 2.035 | 0.074 |
| 2.036 | 0.074 |
| 2.037 | 0.074 |
| 2.038 | 0.074 |
| 2.039 | 0.073 |
| 2.04 | 0.073 |
| 2.041 | 0.073 |
| 2.042 | 0.073 |
| 2.043 | 0.072 |
| 2.044 | 0.072 |
| 2.045 | 0.072 |
| 2.046 | 0.071 |
| 2.047 | 0.071 |
| 2.048 | 0.071 |
| 2.049 | 0.071 |
| 2.05 | 0.07 |
| 2.051 | 0.07 |
| 2.052 | 0.07 |
| 2.053 | 0.07 |
| 2.054 | 0.07 |
| 2.055 | 0.07 |
| 2.056 | 0.069 |
| 2.057 | 0.069 |
| 2.058 | 0.069 |
| 2.059 | 0.069 |
| 2.06 | 0.069 |
| 2.061 | 0.069 |
| 2.062 | 0.069 |
| 2.063 | 0.069 |
| 2.064 | 0.069 |
| 2.065 | 0.068 |
| 2.066 | 0.068 |
| 2.067 | 0.068 |
| 2.068 | 0.068 |
| 2.069 | 0.068 |
| 2.07 | 0.068 |
| 2.071 | 0.067 |
| 2.072 | 0.067 |
| 2.073 | 0.067 |
| 2.074 | 0.067 |
| 2.075 | 0.067 |
| 2.076 | 0.066 |
| 2.077 | 0.066 |
| 2.078 | 0.066 |
| 2.079 | 0.066 |
| 2.08 | 0.065 |
| 2.081 | 0.065 |
| 2.082 | 0.065 |
| 2.083 | 0.065 |
| 2.084 | 0.064 |
| 2.085 | 0.064 |
| 2.086 | 0.064 |
| 2.087 | 0.064 |
| 2.088 | 0.064 |
| 2.089 | 0.063 |
| 2.09 | 0.063 |
| 2.091 | 0.063 |
| 2.092 | 0.063 |
| 2.093 | 0.063 |
| 2.094 | 0.063 |
| 2.095 | 0.063 |
| 2.096 | 0.063 |
| 2.097 | 0.063 |
| 2.098 | 0.063 |
| 2.099 | 0.064 |
| 2.1 | 0.064 |
| 2.101 | 0.064 |
| 2.102 | 0.065 |
| 2.103 | 0.065 |
| 2.104 | 0.065 |
| 2.105 | 0.066 |
| 2.106 | 0.066 |
| 2.107 | 0.067 |
| 2.108 | 0.067 |
| 2.109 | 0.068 |
| 2.11 | 0.068 |
| 2.111 | 0.069 |
| 2.112 | 0.069 |
| 2.113 | 0.07 |
| 2.114 | 0.07 |
| 2.115 | 0.071 |
| 2.116 | 0.072 |
| 2.117 | 0.072 |
| 2.118 | 0.073 |
| 2.119 | 0.073 |
| 2.12 | 0.073 |
| 2.121 | 0.073 |
| 2.122 | 0.073 |
| 2.123 | 0.073 |
| 2.124 | 0.073 |
| 2.125 | 0.072 |
| 2.126 | 0.071 |
| 2.127 | 0.07 |
| 2.128 | 0.068 |
| 2.129 | 0.067 |
| 2.13 | 0.064 |
| 2.131 | 0.062 |
| 2.132 | 0.059 |
| 2.133 | 0.055 |
| 2.134 | 0.051 |
| 2.135 | 0.047 |
| 2.136 | 0.042 |
| 2.137 | 0.036 |
| 2.138 | 0.03 |
| 2.139 | 0.024 |
| 2.14 | 0.017 |
| 2.141 | 0.009 |
| 2.142 | 0.001 |
| 2.143 | -0.008 |
| 2.144 | -0.017 |
| 2.145 | -0.026 |
| 2.146 | -0.036 |
| 2.147 | -0.047 |
| 2.148 | -0.057 |
| 2.149 | -0.069 |
| 2.15 | -0.08 |
| 2.151 | -0.092 |
| 2.152 | -0.103 |
| 2.153 | -0.116 |
| 2.154 | -0.128 |
| 2.155 | -0.14 |
| 2.156 | -0.153 |
| 2.157 | -0.165 |
| 2.158 | -0.178 |
| 2.159 | -0.19 |
| 2.16 | -0.202 |
| 2.161 | -0.214 |
| 2.162 | -0.226 |
| 2.163 | -0.238 |
| 2.164 | -0.249 |
| 2.165 | -0.26 |
| 2.166 | -0.27 |
| 2.167 | -0.28 |
| 2.168 | -0.29 |
| 2.169 | -0.299 |
| 2.17 | -0.308 |
| 2.171 | -0.316 |
| 2.172 | -0.324 |
| 2.173 | -0.332 |
| 2.174 | -0.339 |
| 2.175 | -0.346 |
| 2.176 | -0.352 |
| 2.177 | -0.359 |
| 2.178 | -0.364 |
| 2.179 | -0.37 |
| 2.18 | -0.375 |
| 2.181 | -0.38 |
| 2.182 | -0.385 |
| 2.183 | -0.39 |
| 2.184 | -0.394 |
| 2.185 | -0.398 |
| 2.186 | -0.402 |
| 2.187 | -0.405 |
| 2.188 | -0.408 |
| 2.189 | -0.41 |
| 2.19 | -0.412 |
| 2.191 | -0.413 |
| 2.192 | -0.414 |
| 2.193 | -0.414 |
| 2.194 | -0.413 |
| 2.195 | -0.412 |
| 2.196 | -0.41 |
| 2.197 | -0.407 |
| 2.198 | -0.403 |
| 2.199 | -0.398 |
| 2.2 | -0.393 |
| 2.201 | -0.386 |
| 2.202 | -0.379 |
| 2.203 | -0.371 |
| 2.204 | -0.361 |
| 2.205 | -0.351 |
| 2.206 | -0.34 |
| 2.207 | -0.327 |
| 2.208 | -0.314 |
| 2.209 | -0.3 |
| 2.21 | -0.284 |
| 2.211 | -0.268 |
| 2.212 | -0.251 |
| 2.213 | -0.233 |
| 2.214 | -0.215 |
| 2.215 | -0.195 |
| 2.216 | -0.175 |
| 2.217 | -0.155 |
| 2.218 | -0.133 |
| 2.219 | -0.112 |
| 2.22 | -0.089 |
| 2.221 | -0.067 |
| 2.222 | -0.044 |
| 2.223 | -0.021 |
| 2.224 | 0.002 |
| 2.225 | 0.025 |
| 2.226 | 0.049 |
| 2.227 | 0.072 |
| 2.228 | 0.095 |
| 2.229 | 0.118 |
| 2.23 | 0.14 |
| 2.231 | 0.162 |
| 2.232 | 0.184 |
| 2.233 | 0.205 |
| 2.234 | 0.226 |
| 2.235 | 0.246 |
| 2.236 | 0.266 |
| 2.237 | 0.285 |
| 2.238 | 0.303 |
| 2.239 | 0.32 |
| 2.24 | 0.337 |
| 2.241 | 0.352 |
| 2.242 | 0.367 |
| 2.243 | 0.381 |
| 2.244 | 0.394 |
| 2.245 | 0.406 |
| 2.246 | 0.418 |
| 2.247 | 0.428 |
| 2.248 | 0.438 |
| 2.249 | 0.446 |
| 2.25 | 0.454 |
| 2.251 | 0.462 |
| 2.252 | 0.468 |
| 2.253 | 0.473 |
| 2.254 | 0.478 |
| 2.255 | 0.481 |
| 2.256 | 0.484 |
| 2.257 | 0.486 |
| 2.258 | 0.488 |
| 2.259 | 0.488 |
| 2.26 | 0.487 |
| 2.261 | 0.486 |
| 2.262 | 0.483 |
| 2.263 | 0.48 |
| 2.264 | 0.476 |
| 2.265 | 0.471 |
| 2.266 | 0.465 |
| 2.267 | 0.458 |
| 2.268 | 0.451 |
| 2.269 | 0.442 |
| 2.27 | 0.432 |
| 2.271 | 0.422 |
| 2.272 | 0.41 |
| 2.273 | 0.398 |
| 2.274 | 0.385 |
| 2.275 | 0.371 |
| 2.276 | 0.356 |
| 2.277 | 0.34 |
| 2.278 | 0.323 |
| 2.279 | 0.306 |
| 2.28 | 0.288 |
| 2.281 | 0.27 |
| 2.282 | 0.251 |
| 2.283 | 0.231 |
| 2.284 | 0.211 |
| 2.285 | 0.191 |
| 2.286 | 0.17 |
| 2.287 | 0.149 |
| 2.288 | 0.128 |
| 2.289 | 0.107 |
| 2.29 | 0.085 |
| 2.291 | 0.064 |
| 2.292 | 0.042 |
| 2.293 | 0.02 |
| 2.294 | -0.001 |
| 2.295 | -0.022 |
| 2.296 | -0.044 |
| 2.297 | -0.065 |
| 2.298 | -0.085 |
| 2.299 | -0.106 |
| 2.3 | -0.126 |
| 2.301 | -0.146 |
| 2.302 | -0.165 |
| 2.303 | -0.184 |
| 2.304 | -0.203 |
| 2.305 | -0.221 |
| 2.306 | -0.238 |
| 2.307 | -0.255 |
| 2.308 | -0.272 |
| 2.309 | -0.288 |
| 2.31 | -0.303 |
| 2.311 | -0.318 |
| 2.312 | -0.332 |
| 2.313 | -0.345 |
| 2.314 | -0.358 |
| 2.315 | -0.371 |
| 2.316 | -0.382 |
| 2.317 | -0.394 |
| 2.318 | -0.404 |
| 2.319 | -0.415 |
| 2.32 | -0.424 |
| 2.321 | -0.433 |
| 2.322 | -0.442 |
| 2.323 | -0.45 |
| 2.324 | -0.458 |
| 2.325 | -0.465 |
| 2.326 | -0.472 |
| 2.327 | -0.478 |
| 2.328 | -0.484 |
| 2.329 | -0.49 |
| 2.33 | -0.495 |
| 2.331 | -0.5 |
| 2.332 | -0.505 |
| 2.333 | -0.509 |
| 2.334 | -0.513 |
| 2.335 | -0.517 |
| 2.336 | -0.52 |
| 2.337 | -0.523 |
| 2.338 | -0.526 |
| 2.339 | -0.529 |
| 2.34 | -0.531 |
| 2.341 | -0.533 |
| 2.342 | -0.535 |
| 2.343 | -0.536 |
| 2.344 | -0.537 |
| 2.345 | -0.538 |
| 2.346 | -0.538 |
| 2.347 | -0.539 |
| 2.348 | -0.539 |
| 2.349 | -0.539 |
| 2.35 | -0.538 |
| 2.351 | -0.537 |
| 2.352 | -0.537 |
| 2.353 | -0.536 |
| 2.354 | -0.534 |
| 2.355 | -0.533 |
| 2.356 | -0.532 |
| 2.357 | -0.53 |
| 2.358 | -0.528 |
| 2.359 | -0.526 |
| 2.36 | -0.524 |
| 2.361 | -0.522 |
| 2.362 | -0.52 |
| 2.363 | -0.517 |
| 2.364 | -0.515 |
| 2.365 | -0.512 |
| 2.366 | -0.51 |
| 2.367 | -0.507 |
| 2.368 | -0.504 |
| 2.369 | -0.501 |
| 2.37 | -0.497 |
| 2.371 | -0.494 |
| 2.372 | -0.491 |
| 2.373 | -0.487 |
| 2.374 | -0.484 |
| 2.375 | -0.48 |
| 2.376 | -0.477 |
| 2.377 | -0.473 |
| 2.378 | -0.469 |
| 2.379 | -0.466 |
| 2.38 | -0.462 |
| 2.381 | -0.459 |
| 2.382 | -0.455 |
| 2.383 | -0.452 |
| 2.384 | -0.448 |
| 2.385 | -0.445 |
| 2.386 | -0.442 |
| 2.387 | -0.438 |
| 2.388 | -0.435 |
| 2.389 | -0.432 |
| 2.39 | -0.429 |
| 2.391 | -0.426 |
| 2.392 | -0.423 |
| 2.393 | -0.42 |
| 2.394 | -0.416 |
| 2.395 | -0.413 |
| 2.396 | -0.41 |
| 2.397 | -0.407 |
| 2.398 | -0.404 |
| 2.399 | -0.401 |
| 2.4 | -0.398 |
| 2.401 | -0.395 |
| 2.402 | -0.392 |
| 2.403 | -0.389 |
| 2.404 | -0.386 |
| 2.405 | -0.384 |
| 2.406 | -0.381 |
| 2.407 | -0.379 |
| 2.408 | -0.376 |
| 2.409 | -0.374 |
| 2.41 | -0.371 |
| 2.411 | -0.369 |
| 2.412 | -0.367 |
| 2.413 | -0.365 |
| 2.414 | -0.363 |
| 2.415 | -0.361 |
| 2.416 | -0.359 |
| 2.417 | -0.357 |
| 2.418 | -0.355 |
| 2.419 | -0.353 |
| 2.42 | -0.351 |
| 2.421 | -0.349 |
| 2.422 | -0.347 |
| 2.423 | -0.345 |
| 2.424 | -0.343 |
| 2.425 | -0.341 |
| 2.426 | -0.339 |
| 2.427 | -0.337 |
| 2.428 | -0.335 |
| 2.429 | -0.333 |
| 2.43 | -0.331 |
| 2.431 | -0.329 |
| 2.432 | -0.327 |
| 2.433 | -0.325 |
| 2.434 | -0.323 |
| 2.435 | -0.321 |
| 2.436 | -0.319 |
| 2.437 | -0.318 |
| 2.438 | -0.316 |
| 2.439 | -0.314 |
| 2.44 | -0.313 |
| 2.441 | -0.312 |
| 2.442 | -0.31 |
| 2.443 | -0.309 |
| 2.444 | -0.308 |
| 2.445 | -0.308 |
| 2.446 | -0.307 |
| 2.447 | -0.307 |
| 2.448 | -0.307 |
| 2.449 | -0.307 |
| 2.45 | -0.307 |
| 2.451 | -0.307 |
| 2.452 | -0.307 |
| 2.453 | -0.308 |
| 2.454 | -0.308 |
| 2.455 | -0.309 |
| 2.456 | -0.31 |
| 2.457 | -0.31 |
| 2.458 | -0.311 |
| 2.459 | -0.312 |
| 2.46 | -0.312 |
| 2.461 | -0.313 |
| 2.462 | -0.313 |
| 2.463 | -0.314 |
| 2.464 | -0.314 |
| 2.465 | -0.314 |
| 2.466 | -0.315 |
| 2.467 | -0.315 |
| 2.468 | -0.315 |
| 2.469 | -0.315 |
| 2.47 | -0.314 |
| 2.471 | -0.314 |
| 2.472 | -0.313 |
| 2.473 | -0.312 |
| 2.474 | -0.311 |
| 2.475 | -0.31 |
| 2.476 | -0.309 |
| 2.477 | -0.307 |
| 2.478 | -0.305 |
| 2.479 | -0.304 |
| 2.48 | -0.302 |
| 2.481 | -0.299 |
| 2.482 | -0.297 |
| 2.483 | -0.295 |
| 2.484 | -0.293 |
| 2.485 | -0.29 |
| 2.486 | -0.288 |
| 2.487 | -0.285 |
| 2.488 | -0.282 |
| 2.489 | -0.28 |
| 2.49 | -0.277 |
| 2.491 | -0.274 |
| 2.492 | -0.271 |
| 2.493 | -0.269 |
| 2.494 | -0.266 |
| 2.495 | -0.263 |
| 2.496 | -0.26 |
| 2.497 | -0.258 |
| 2.498 | -0.255 |
| 2.499 | -0.253 |
| 2.5 | -0.251 |
| 2.501 | -0.249 |
| 2.502 | -0.246 |
| 2.503 | -0.244 |
| 2.504 | -0.242 |
| 2.505 | -0.24 |
| 2.506 | -0.238 |
| 2.507 | -0.236 |
| 2.508 | -0.234 |
| 2.509 | -0.233 |
| 2.51 | -0.231 |
| 2.511 | -0.23 |
| 2.512 | -0.228 |
| 2.513 | -0.227 |
| 2.514 | -0.226 |
| 2.515 | -0.225 |
| 2.516 | -0.224 |
| 2.517 | -0.223 |
| 2.518 | -0.222 |
| 2.519 | -0.221 |
| 2.52 | -0.22 |
| 2.521 | -0.22 |
| 2.522 | -0.219 |
| 2.523 | -0.219 |
| 2.524 | -0.218 |
| 2.525 | -0.218 |
| 2.526 | -0.217 |
| 2.527 | -0.217 |
| 2.528 | -0.216 |
| 2.529 | -0.216 |
| 2.53 | -0.216 |
| 2.531 | -0.215 |
| 2.532 | -0.215 |
| 2.533 | -0.215 |
| 2.534 | -0.214 |
| 2.535 | -0.214 |
| 2.536 | -0.214 |
| 2.537 | -0.214 |
| 2.538 | -0.214 |
| 2.539 | -0.213 |
| 2.54 | -0.214 |
| 2.541 | -0.214 |
| 2.542 | -0.214 |
| 2.543 | -0.214 |
| 2.544 | -0.214 |
| 2.545 | -0.215 |
| 2.546 | -0.215 |
| 2.547 | -0.216 |
| 2.548 | -0.217 |
| 2.549 | -0.218 |
| 2.55 | -0.219 |
| 2.551 | -0.22 |
| 2.552 | -0.221 |
| 2.553 | -0.222 |
| 2.554 | -0.223 |
| 2.555 | -0.224 |
| 2.556 | -0.226 |
| 2.557 | -0.227 |
| 2.558 | -0.228 |
| 2.559 | -0.23 |
| 2.56 | -0.231 |
| 2.561 | -0.232 |
| 2.562 | -0.234 |
| 2.563 | -0.235 |
| 2.564 | -0.236 |
| 2.565 | -0.238 |
| 2.566 | -0.239 |
| 2.567 | -0.24 |
| 2.568 | -0.241 |
| 2.569 | -0.242 |
| 2.57 | -0.243 |
| 2.571 | -0.244 |
| 2.572 | -0.244 |
| 2.573 | -0.245 |
| 2.574 | -0.245 |
| 2.575 | -0.246 |
| 2.576 | -0.246 |
| 2.577 | -0.246 |
| 2.578 | -0.247 |
| 2.579 | -0.247 |
| 2.58 | -0.247 |
| 2.581 | -0.247 |
| 2.582 | -0.247 |
| 2.583 | -0.247 |
| 2.584 | -0.247 |
| 2.585 | -0.247 |
| 2.586 | -0.247 |
| 2.587 | -0.247 |
| 2.588 | -0.247 |
| 2.589 | -0.247 |
| 2.59 | -0.247 |
| 2.591 | -0.247 |
| 2.592 | -0.247 |
| 2.593 | -0.248 |
| 2.594 | -0.248 |
| 2.595 | -0.248 |
| 2.596 | -0.249 |
| 2.597 | -0.249 |
| 2.598 | -0.25 |
| 2.599 | -0.25 |
| 2.6 | -0.251 |
| 2.601 | -0.252 |
| 2.602 | -0.253 |
| 2.603 | -0.254 |
| 2.604 | -0.255 |
| 2.605 | -0.256 |
| 2.606 | -0.257 |
| 2.607 | -0.258 |
| 2.608 | -0.259 |
| 2.609 | -0.26 |
| 2.61 | -0.261 |
| 2.611 | -0.262 |
| 2.612 | -0.264 |
| 2.613 | -0.265 |
| 2.614 | -0.266 |
| 2.615 | -0.267 |
| 2.616 | -0.268 |
| 2.617 | -0.269 |
| 2.618 | -0.27 |
| 2.619 | -0.271 |
| 2.62 | -0.272 |
| 2.621 | -0.273 |
| 2.622 | -0.274 |
| 2.623 | -0.275 |
| 2.624 | -0.276 |
| 2.625 | -0.276 |
| 2.626 | -0.277 |
| 2.627 | -0.278 |
| 2.628 | -0.278 |
| 2.629 | -0.279 |
| 2.63 | -0.279 |
| 2.631 | -0.28 |
| 2.632 | -0.28 |
| 2.633 | -0.28 |
| 2.634 | -0.281 |
| 2.635 | -0.281 |
| 2.636 | -0.281 |
| 2.637 | -0.281 |
| 2.638 | -0.28 |
| 2.639 | -0.28 |
| 2.64 | -0.28 |
| 2.641 | -0.279 |
| 2.642 | -0.278 |
| 2.643 | -0.277 |
| 2.644 | -0.276 |
| 2.645 | -0.275 |
| 2.646 | -0.274 |
| 2.647 | -0.272 |
| 2.648 | -0.271 |
| 2.649 | -0.268 |
| 2.65 | -0.266 |
| 2.651 | -0.264 |
| 2.652 | -0.261 |
| 2.653 | -0.258 |
| 2.654 | -0.254 |
| 2.655 | -0.25 |
| 2.656 | -0.246 |
| 2.657 | -0.242 |
| 2.658 | -0.237 |
| 2.659 | -0.233 |
| 2.66 | -0.228 |
| 2.661 | -0.222 |
| 2.662 | -0.217 |
| 2.663 | -0.211 |
| 2.664 | -0.205 |
| 2.665 | -0.2 |
| 2.666 | -0.194 |
| 2.667 | -0.187 |
| 2.668 | -0.181 |
| 2.669 | -0.175 |
| 2.67 | -0.169 |
| 2.671 | -0.162 |
| 2.672 | -0.156 |
| 2.673 | -0.149 |
| 2.674 | -0.143 |
| 2.675 | -0.137 |
| 2.676 | -0.13 |
| 2.677 | -0.124 |
| 2.678 | -0.118 |
| 2.679 | -0.112 |
| 2.68 | -0.106 |
| 2.681 | -0.1 |
| 2.682 | -0.095 |
| 2.683 | -0.09 |
| 2.684 | -0.084 |
| 2.685 | -0.08 |
| 2.686 | -0.075 |
| 2.687 | -0.071 |
| 2.688 | -0.067 |
| 2.689 | -0.063 |
| 2.69 | -0.059 |
| 2.691 | -0.056 |
| 2.692 | -0.053 |
| 2.693 | -0.05 |
| 2.694 | -0.048 |
| 2.695 | -0.046 |
| 2.696 | -0.044 |
| 2.697 | -0.042 |
| 2.698 | -0.041 |
| 2.699 | -0.04 |
| 2.7 | -0.039 |
| 2.701 | -0.039 |
| 2.702 | -0.039 |
| 2.703 | -0.039 |
| 2.704 | -0.039 |
| 2.705 | -0.039 |
| 2.706 | -0.04 |
| 2.707 | -0.041 |
| 2.708 | -0.042 |
| 2.709 | -0.043 |
| 2.71 | -0.044 |
| 2.711 | -0.046 |
| 2.712 | -0.047 |
| 2.713 | -0.049 |
| 2.714 | -0.05 |
| 2.715 | -0.052 |
| 2.716 | -0.054 |
| 2.717 | -0.055 |
| 2.718 | -0.057 |
| 2.719 | -0.058 |
| 2.72 | -0.06 |
| 2.721 | -0.061 |
| 2.722 | -0.063 |
| 2.723 | -0.064 |
| 2.724 | -0.065 |
| 2.725 | -0.066 |
| 2.726 | -0.067 |
| 2.727 | -0.068 |
| 2.728 | -0.069 |
| 2.729 | -0.07 |
| 2.73 | -0.071 |
| 2.731 | -0.072 |
| 2.732 | -0.072 |
| 2.733 | -0.073 |
| 2.734 | -0.074 |
| 2.735 | -0.074 |
| 2.736 | -0.075 |
| 2.737 | -0.075 |
| 2.738 | -0.075 |
| 2.739 | -0.076 |
| 2.74 | -0.076 |
| 2.741 | -0.076 |
| 2.742 | -0.076 |
| 2.743 | -0.076 |
| 2.744 | -0.076 |
| 2.745 | -0.076 |
| 2.746 | -0.076 |
| 2.747 | -0.076 |
| 2.748 | -0.075 |
| 2.749 | -0.075 |
| 2.75 | -0.075 |
| 2.751 | -0.074 |
| 2.752 | -0.074 |
| 2.753 | -0.074 |
| 2.754 | -0.073 |
| 2.755 | -0.073 |
| 2.756 | -0.072 |
| 2.757 | -0.072 |
| 2.758 | -0.071 |
| 2.759 | -0.071 |
| 2.76 | -0.07 |
| 2.761 | -0.07 |
| 2.762 | -0.069 |
| 2.763 | -0.068 |
| 2.764 | -0.068 |
| 2.765 | -0.067 |
| 2.766 | -0.066 |
| 2.767 | -0.066 |
| 2.768 | -0.065 |
| 2.769 | -0.064 |
| 2.77 | -0.064 |
| 2.771 | -0.063 |
| 2.772 | -0.063 |
| 2.773 | -0.062 |
| 2.774 | -0.062 |
| 2.775 | -0.061 |
| 2.776 | -0.061 |
| 2.777 | -0.061 |
| 2.778 | -0.06 |
| 2.779 | -0.06 |
| 2.78 | -0.06 |
| 2.781 | -0.06 |
| 2.782 | -0.06 |
| 2.783 | -0.06 |
| 2.784 | -0.06 |
| 2.785 | -0.06 |
| 2.786 | -0.06 |
| 2.787 | -0.06 |
| 2.788 | -0.06 |
| 2.789 | -0.061 |
| 2.79 | -0.061 |
| 2.791 | -0.061 |
| 2.792 | -0.062 |
| 2.793 | -0.062 |
| 2.794 | -0.062 |
| 2.795 | -0.062 |
| 2.796 | -0.062 |
| 2.797 | -0.063 |
| 2.798 | -0.063 |
| 2.799 | -0.063 |
| 2.8 | -0.063 |
| 2.801 | -0.063 |
| 2.802 | -0.063 |
| 2.803 | -0.062 |
| 2.804 | -0.062 |
| 2.805 | -0.062 |
| 2.806 | -0.061 |
| 2.807 | -0.061 |
| 2.808 | -0.06 |
| 2.809 | -0.059 |
| 2.81 | -0.058 |
| 2.811 | -0.057 |
| 2.812 | -0.056 |
| 2.813 | -0.055 |
| 2.814 | -0.054 |
| 2.815 | -0.053 |
| 2.816 | -0.052 |
| 2.817 | -0.051 |
| 2.818 | -0.049 |
| 2.819 | -0.048 |
| 2.82 | -0.047 |
| 2.821 | -0.046 |
| 2.822 | -0.044 |
| 2.823 | -0.043 |
| 2.824 | -0.042 |
| 2.825 | -0.041 |
| 2.826 | -0.039 |
| 2.827 | -0.038 |
| 2.828 | -0.037 |
| 2.829 | -0.036 |
| 2.83 | -0.035 |
| 2.831 | -0.034 |
| 2.832 | -0.033 |
| 2.833 | -0.032 |
| 2.834 | -0.031 |
| 2.835 | -0.031 |
| 2.836 | -0.03 |
| 2.837 | -0.029 |
| 2.838 | -0.029 |
| 2.839 | -0.028 |
| 2.84 | -0.028 |
| 2.841 | -0.028 |
| 2.842 | -0.027 |
| 2.843 | -0.027 |
| 2.844 | -0.027 |
| 2.845 | -0.027 |
| 2.846 | -0.028 |
| 2.847 | -0.028 |
| 2.848 | -0.028 |
| 2.849 | -0.029 |
| 2.85 | -0.029 |
| 2.851 | -0.029 |
| 2.852 | -0.03 |
| 2.853 | -0.03 |
| 2.854 | -0.03 |
| 2.855 | -0.031 |
| 2.856 | -0.031 |
| 2.857 | -0.031 |
| 2.858 | -0.032 |
| 2.859 | -0.032 |
| 2.86 | -0.032 |
| 2.861 | -0.033 |
| 2.862 | -0.033 |
| 2.863 | -0.033 |
| 2.864 | -0.034 |
| 2.865 | -0.034 |
| 2.866 | -0.035 |
| 2.867 | -0.035 |
| 2.868 | -0.036 |
| 2.869 | -0.036 |
| 2.87 | -0.036 |
| 2.871 | -0.037 |
| 2.872 | -0.037 |
| 2.873 | -0.038 |
| 2.874 | -0.038 |
| 2.875 | -0.039 |
| 2.876 | -0.039 |
| 2.877 | -0.04 |
| 2.878 | -0.04 |
| 2.879 | -0.041 |
| 2.88 | -0.041 |
| 2.881 | -0.042 |
| 2.882 | -0.042 |
| 2.883 | -0.042 |
| 2.884 | -0.043 |
| 2.885 | -0.043 |
| 2.886 | -0.044 |
| 2.887 | -0.044 |
| 2.888 | -0.044 |
| 2.889 | -0.045 |
| 2.89 | -0.046 |
| 2.891 | -0.046 |
| 2.892 | -0.047 |
| 2.893 | -0.048 |
| 2.894 | -0.048 |
| 2.895 | -0.049 |
| 2.896 | -0.05 |
| 2.897 | -0.051 |
| 2.898 | -0.052 |
| 2.899 | -0.053 |
| 2.9 | -0.055 |
| 2.901 | -0.056 |
| 2.902 | -0.057 |
| 2.903 | -0.059 |
| 2.904 | -0.06 |
| 2.905 | -0.062 |
| 2.906 | -0.064 |
| 2.907 | -0.066 |
| 2.908 | -0.067 |
| 2.909 | -0.069 |
| 2.91 | -0.072 |
| 2.911 | -0.074 |
| 2.912 | -0.076 |
| 2.913 | -0.078 |
| 2.914 | -0.08 |
| 2.915 | -0.083 |
| 2.916 | -0.085 |
| 2.917 | -0.087 |
| 2.918 | -0.09 |
| 2.919 | -0.092 |
| 2.92 | -0.095 |
| 2.921 | -0.097 |
| 2.922 | -0.099 |
| 2.923 | -0.102 |
| 2.924 | -0.104 |
| 2.925 | -0.107 |
| 2.926 | -0.109 |
| 2.927 | -0.111 |
| 2.928 | -0.114 |
| 2.929 | -0.116 |
| 2.93 | -0.118 |
| 2.931 | -0.121 |
| 2.932 | -0.123 |
| 2.933 | -0.125 |
| 2.934 | -0.127 |
| 2.935 | -0.129 |
| 2.936 | -0.131 |
| 2.937 | -0.133 |
| 2.938 | -0.134 |
| 2.939 | -0.136 |
| 2.94 | -0.138 |
| 2.941 | -0.139 |
| 2.942 | -0.14 |
| 2.943 | -0.142 |
| 2.944 | -0.143 |
| 2.945 | -0.144 |
| 2.946 | -0.145 |
| 2.947 | -0.146 |
| 2.948 | -0.147 |
| 2.949 | -0.147 |
| 2.95 | -0.148 |
| 2.951 | -0.148 |
| 2.952 | -0.148 |
| 2.953 | -0.148 |
| 2.954 | -0.148 |
| 2.955 | -0.148 |
| 2.956 | -0.148 |
| 2.957 | -0.148 |
| 2.958 | -0.147 |
| 2.959 | -0.146 |
| 2.96 | -0.146 |
| 2.961 | -0.145 |
| 2.962 | -0.144 |
| 2.963 | -0.143 |
| 2.964 | -0.142 |
| 2.965 | -0.141 |
| 2.966 | -0.139 |
| 2.967 | -0.138 |
| 2.968 | -0.137 |
| 2.969 | -0.135 |
| 2.97 | -0.134 |
| 2.971 | -0.133 |
| 2.972 | -0.131 |
| 2.973 | -0.13 |
| 2.974 | -0.128 |
| 2.975 | -0.127 |
| 2.976 | -0.126 |
| 2.977 | -0.124 |
| 2.978 | -0.123 |
| 2.979 | -0.121 |
| 2.98 | -0.12 |
| 2.981 | -0.119 |
| 2.982 | -0.117 |
| 2.983 | -0.116 |
| 2.984 | -0.115 |
| 2.985 | -0.114 |
| 2.986 | -0.113 |
| 2.987 | -0.112 |
| 2.988 | -0.111 |
| 2.989 | -0.11 |
| 2.99 | -0.109 |
| 2.991 | -0.109 |
| 2.992 | -0.108 |
| 2.993 | -0.107 |
| 2.994 | -0.107 |
| 2.995 | -0.106 |
| 2.996 | -0.106 |
| 2.997 | -0.106 |
| 2.998 | -0.106 |
| 2.999 | -0.106 |